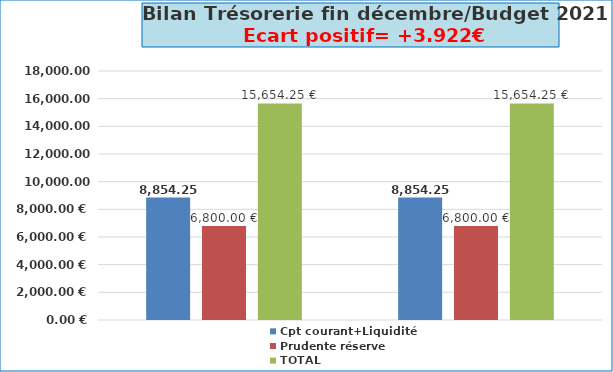
| Category | Cpt courant+Liquidité | Prudente réserve | TOTAL |
|---|---|---|---|
| 0 | 8854.25 | 6800 | 15654.25 |
| 1 | 8854.25 | 6800 | 15654.25 |